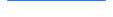
| Category | Series 0 |
|---|---|
| 0 | 16 |
| 1 | 16 |
| 2 | 18 |
| 3 | 11 |
| 4 | 12 |
| 5 | 4 |
| 6 | 7 |
| 7 | 10 |
| 8 | 5 |